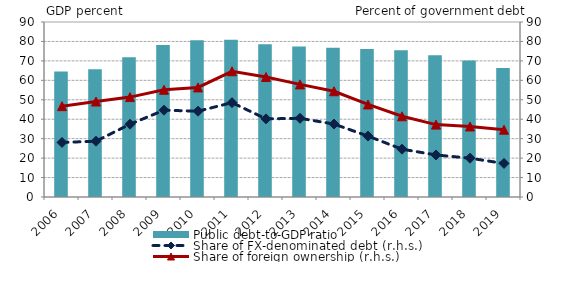
| Category | Public debt-to-GDP ratio |
|---|---|
| 2006.0 | 64.504 |
| 2007.0 | 65.654 |
| 2008.0 | 71.843 |
| 2009.0 | 78.217 |
| 2010.0 | 80.641 |
| 2011.0 | 80.812 |
| 2012.0 | 78.558 |
| 2013.0 | 77.355 |
| 2014.0 | 76.801 |
| 2015.0 | 76.146 |
| 2016.0 | 75.485 |
| 2017.0 | 72.891 |
| 2018.0 | 70.219 |
| 2019.0 | 66.366 |